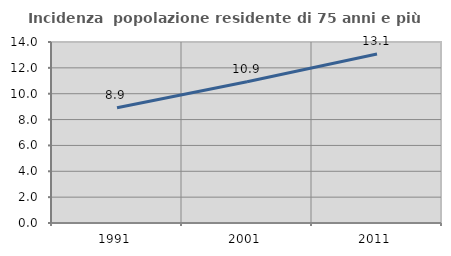
| Category | Incidenza  popolazione residente di 75 anni e più |
|---|---|
| 1991.0 | 8.919 |
| 2001.0 | 10.922 |
| 2011.0 | 13.077 |